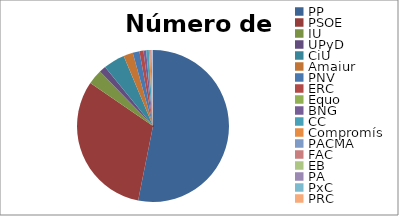
| Category | % Esc. | Votos |
|---|---|---|
| PP | 0.531 | 10866566 |
| PSOE | 0.314 | 7003511 |
| IU | 0.031 | 1685991 |
| UPyD | 0.014 | 1143225 |
| CiU | 0.046 | 1015691 |
| Amaiur | 0.02 | 334498 |
| PNV | 0.014 | 324317 |
| ERC | 0.009 | 256393 |
| Equo | 0 | 216748 |
| BNG | 0.006 | 184037 |
| CC | 0.006 | 143881 |
| Compromís | 0.003 | 125306 |
| PACMA | 0 | 102144 |
| FAC | 0.003 | 99473 |
| EB | 0 | 97673 |
| PA | 0 | 76999 |
| PxC | 0 | 59949 |
| PRC | 0 | 44010 |
| GB | 0.003 | 42415 |